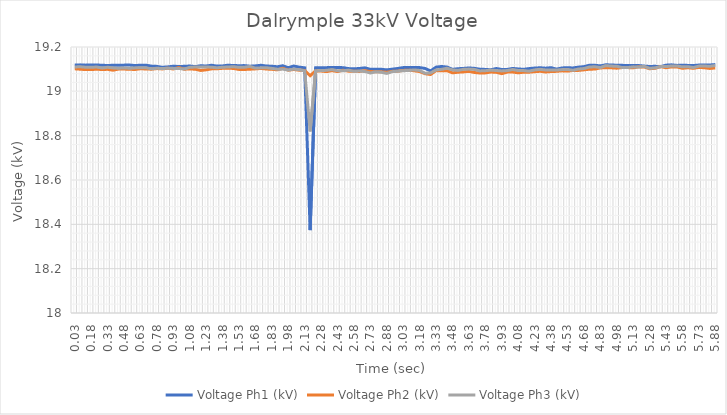
| Category | Voltage Ph1 (kV) | Voltage Ph2 (kV) | Voltage Ph3 (kV) |
|---|---|---|---|
| 0.03 | 19.119 | 19.102 | 19.11 |
| 0.08 | 19.119 | 19.1 | 19.111 |
| 0.13 | 19.118 | 19.098 | 19.109 |
| 0.18 | 19.119 | 19.098 | 19.108 |
| 0.23 | 19.118 | 19.1 | 19.11 |
| 0.28 | 19.118 | 19.098 | 19.105 |
| 0.33 | 19.116 | 19.099 | 19.109 |
| 0.38 | 19.118 | 19.095 | 19.106 |
| 0.43 | 19.118 | 19.1 | 19.104 |
| 0.48 | 19.118 | 19.1 | 19.106 |
| 0.53 | 19.119 | 19.099 | 19.104 |
| 0.58 | 19.116 | 19.099 | 19.106 |
| 0.63 | 19.118 | 19.102 | 19.106 |
| 0.68 | 19.118 | 19.101 | 19.106 |
| 0.73 | 19.114 | 19.1 | 19.101 |
| 0.78 | 19.112 | 19.103 | 19.104 |
| 0.83 | 19.108 | 19.101 | 19.103 |
| 0.88 | 19.11 | 19.104 | 19.104 |
| 0.93 | 19.113 | 19.101 | 19.104 |
| 0.98 | 19.112 | 19.107 | 19.103 |
| 1.03 | 19.113 | 19.1 | 19.101 |
| 1.08 | 19.114 | 19.101 | 19.108 |
| 1.13 | 19.111 | 19.1 | 19.11 |
| 1.18 | 19.115 | 19.094 | 19.109 |
| 1.23 | 19.114 | 19.097 | 19.11 |
| 1.28 | 19.118 | 19.101 | 19.109 |
| 1.33 | 19.114 | 19.102 | 19.106 |
| 1.38 | 19.115 | 19.104 | 19.109 |
| 1.43 | 19.118 | 19.104 | 19.11 |
| 1.48 | 19.116 | 19.103 | 19.111 |
| 1.53 | 19.116 | 19.099 | 19.108 |
| 1.58 | 19.116 | 19.099 | 19.109 |
| 1.63 | 19.113 | 19.1 | 19.112 |
| 1.68 | 19.115 | 19.101 | 19.105 |
| 1.73 | 19.118 | 19.103 | 19.106 |
| 1.78 | 19.114 | 19.101 | 19.107 |
| 1.83 | 19.113 | 19.099 | 19.103 |
| 1.88 | 19.111 | 19.097 | 19.1 |
| 1.93 | 19.115 | 19.104 | 19.1 |
| 1.98 | 19.106 | 19.095 | 19.096 |
| 2.03 | 19.114 | 19.099 | 19.1 |
| 2.08 | 19.109 | 19.095 | 19.098 |
| 2.13 | 19.106 | 19.094 | 19.092 |
| 2.18 | 18.374 | 19.07 | 18.819 |
| 2.23 | 19.106 | 19.092 | 19.093 |
| 2.28 | 19.106 | 19.091 | 19.094 |
| 2.33 | 19.107 | 19.089 | 19.095 |
| 2.38 | 19.108 | 19.093 | 19.098 |
| 2.43 | 19.107 | 19.089 | 19.093 |
| 2.48 | 19.107 | 19.095 | 19.093 |
| 2.53 | 19.103 | 19.091 | 19.096 |
| 2.58 | 19.102 | 19.091 | 19.09 |
| 2.63 | 19.103 | 19.09 | 19.092 |
| 2.68 | 19.106 | 19.093 | 19.089 |
| 2.73 | 19.099 | 19.089 | 19.083 |
| 2.78 | 19.099 | 19.088 | 19.088 |
| 2.83 | 19.099 | 19.088 | 19.086 |
| 2.88 | 19.097 | 19.086 | 19.081 |
| 2.93 | 19.1 | 19.09 | 19.089 |
| 2.98 | 19.103 | 19.091 | 19.091 |
| 3.03 | 19.107 | 19.094 | 19.093 |
| 3.08 | 19.107 | 19.096 | 19.094 |
| 3.13 | 19.108 | 19.093 | 19.097 |
| 3.18 | 19.107 | 19.089 | 19.094 |
| 3.23 | 19.103 | 19.079 | 19.081 |
| 3.28 | 19.092 | 19.076 | 19.083 |
| 3.33 | 19.109 | 19.094 | 19.096 |
| 3.38 | 19.112 | 19.093 | 19.099 |
| 3.43 | 19.109 | 19.093 | 19.104 |
| 3.48 | 19.099 | 19.083 | 19.097 |
| 3.53 | 19.102 | 19.086 | 19.094 |
| 3.58 | 19.103 | 19.088 | 19.099 |
| 3.63 | 19.106 | 19.09 | 19.1 |
| 3.68 | 19.104 | 19.085 | 19.099 |
| 3.73 | 19.1 | 19.083 | 19.092 |
| 3.78 | 19.099 | 19.083 | 19.093 |
| 3.83 | 19.097 | 19.087 | 19.096 |
| 3.88 | 19.103 | 19.086 | 19.094 |
| 3.93 | 19.099 | 19.08 | 19.092 |
| 3.98 | 19.099 | 19.087 | 19.094 |
| 4.03 | 19.103 | 19.087 | 19.098 |
| 4.08 | 19.101 | 19.084 | 19.094 |
| 4.13 | 19.099 | 19.086 | 19.094 |
| 4.18 | 19.103 | 19.086 | 19.091 |
| 4.23 | 19.105 | 19.089 | 19.097 |
| 4.28 | 19.106 | 19.09 | 19.099 |
| 4.33 | 19.105 | 19.087 | 19.096 |
| 4.38 | 19.107 | 19.089 | 19.096 |
| 4.43 | 19.1 | 19.09 | 19.096 |
| 4.48 | 19.106 | 19.092 | 19.098 |
| 4.53 | 19.107 | 19.091 | 19.099 |
| 4.58 | 19.105 | 19.094 | 19.095 |
| 4.63 | 19.109 | 19.094 | 19.101 |
| 4.68 | 19.111 | 19.097 | 19.103 |
| 4.73 | 19.118 | 19.1 | 19.11 |
| 4.78 | 19.117 | 19.1 | 19.111 |
| 4.83 | 19.115 | 19.106 | 19.107 |
| 4.88 | 19.12 | 19.106 | 19.116 |
| 4.93 | 19.119 | 19.106 | 19.114 |
| 4.98 | 19.118 | 19.104 | 19.113 |
| 5.03 | 19.117 | 19.107 | 19.107 |
| 5.08 | 19.117 | 19.107 | 19.107 |
| 5.13 | 19.117 | 19.106 | 19.11 |
| 5.18 | 19.116 | 19.11 | 19.109 |
| 5.23 | 19.114 | 19.11 | 19.112 |
| 5.28 | 19.112 | 19.102 | 19.104 |
| 5.33 | 19.113 | 19.104 | 19.106 |
| 5.38 | 19.111 | 19.112 | 19.112 |
| 5.43 | 19.118 | 19.106 | 19.111 |
| 5.48 | 19.12 | 19.11 | 19.115 |
| 5.53 | 19.117 | 19.11 | 19.115 |
| 5.58 | 19.118 | 19.104 | 19.11 |
| 5.63 | 19.117 | 19.107 | 19.111 |
| 5.68 | 19.116 | 19.104 | 19.108 |
| 5.73 | 19.118 | 19.108 | 19.114 |
| 5.78 | 19.119 | 19.106 | 19.114 |
| 5.83 | 19.119 | 19.103 | 19.113 |
| 5.88 | 19.121 | 19.106 | 19.117 |